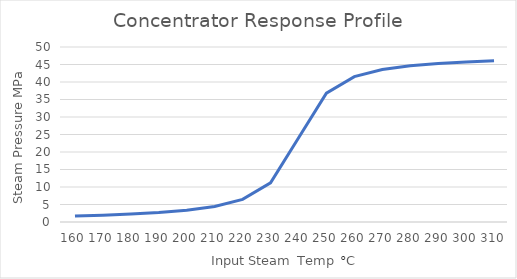
| Category | Series 0 |
|---|---|
| 160.0 | 1.712 |
| 170.0 | 1.954 |
| 180.0 | 2.275 |
| 190.0 | 2.721 |
| 200.0 | 3.381 |
| 210.0 | 4.453 |
| 220.0 | 6.461 |
| 230.0 | 11.197 |
| 240.0 | 24 |
| 250.0 | 36.803 |
| 260.0 | 41.539 |
| 270.0 | 43.547 |
| 280.0 | 44.619 |
| 290.0 | 45.279 |
| 300.0 | 45.725 |
| 310.0 | 46.046 |